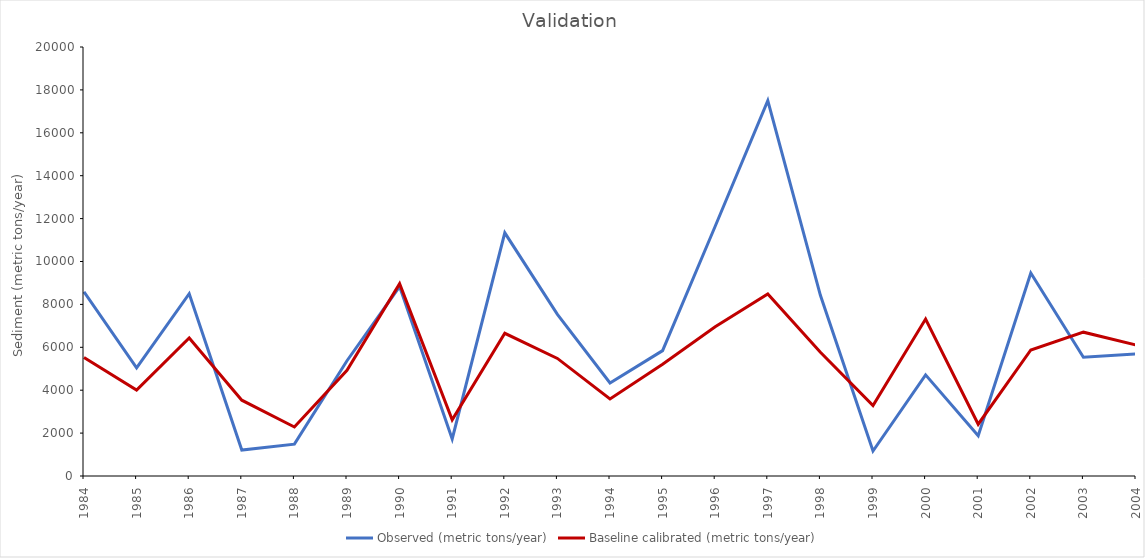
| Category | Observed (metric tons/year) | Baseline calibrated (metric tons/year) |
|---|---|---|
| 1984.0 | 8587.151 | 5522 |
| 1985.0 | 5042.122 | 4003 |
| 1986.0 | 8496.605 | 6432 |
| 1987.0 | 1207.753 | 3534 |
| 1988.0 | 1485.516 | 2285 |
| 1989.0 | 5374.004 | 4927 |
| 1990.0 | 8832.062 | 8967 |
| 1991.0 | 1728.951 | 2620 |
| 1992.0 | 11337.403 | 6653 |
| 1993.0 | 7534.808 | 5482 |
| 1994.0 | 4338.37 | 3592 |
| 1995.0 | 5844.211 | 5212 |
| 1996.0 | 11644.666 | 6957 |
| 1997.0 | 17495.489 | 8483 |
| 1998.0 | 8424.631 | 5772 |
| 1999.0 | 1166.16 | 3288 |
| 2000.0 | 4716.793 | 7317 |
| 2001.0 | 1879.708 | 2413 |
| 2002.0 | 9463.908 | 5876 |
| 2003.0 | 5533.008 | 6705 |
| 2004.0 | 5690.864 | 6105 |